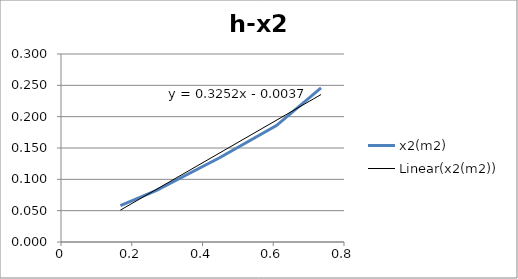
| Category | x2(m2) |
|---|---|
| 0.168 | 0.058 |
| 0.27 | 0.082 |
| 0.447 | 0.134 |
| 0.609 | 0.186 |
| 0.735 | 0.246 |